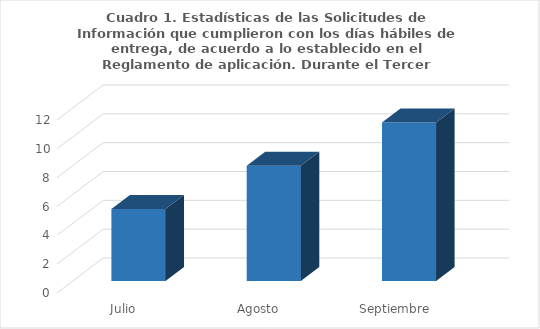
| Category | Series 0 |
|---|---|
| Julio | 5 |
| Agosto | 8 |
| Septiembre | 11 |